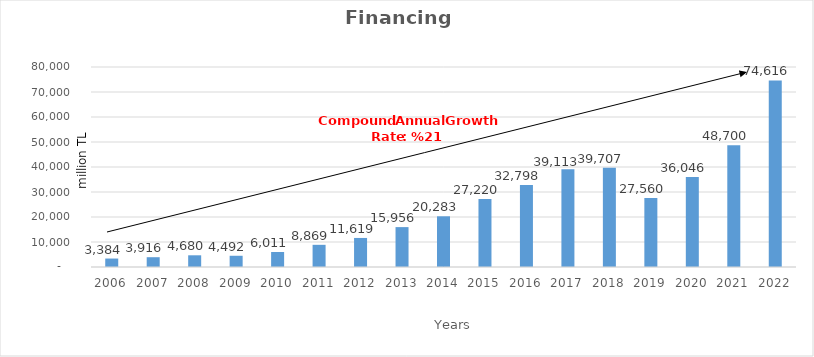
| Category | Financing |
|---|---|
| 2006.0 | 3383.739 |
| 2007.0 | 3915.729 |
| 2008.0 | 4679.889 |
| 2009.0 | 4491.52 |
| 2010.0 | 6010.557 |
| 2011.0 | 8869.447 |
| 2012.0 | 11618.97 |
| 2013.0 | 15956.177 |
| 2014.0 | 20283 |
| 2015.0 | 27220 |
| 2016.0 | 32798 |
| 2017.0 | 39113 |
| 2018.0 | 39707 |
| 2019.0 | 27560 |
| 2020.0 | 36046 |
| 2021.0 | 48700 |
| 2022.0 | 74616 |